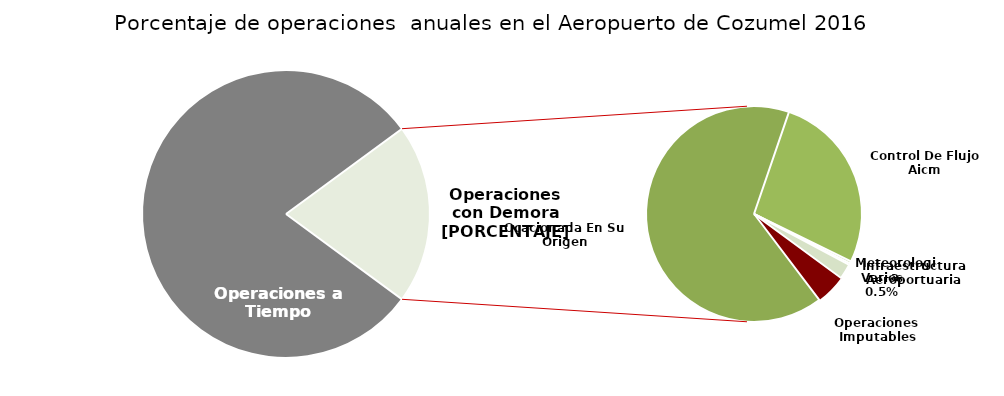
| Category | Series 0 |
|---|---|
| Operaciones a Tiempo | 3619 |
| Operaciones Imputables | 42 |
| Ocacionada En Su Origen | 600 |
| Control De Flujo Aicm | 247 |
| Infraestructura Aeroportuaria | 3 |
| Meteorologia | 2 |
| Varios | 21 |